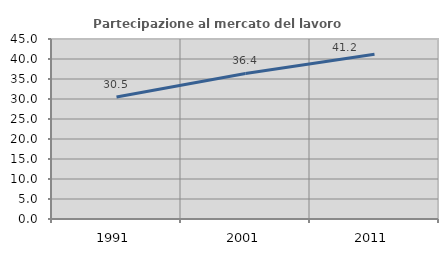
| Category | Partecipazione al mercato del lavoro  femminile |
|---|---|
| 1991.0 | 30.477 |
| 2001.0 | 36.395 |
| 2011.0 | 41.161 |